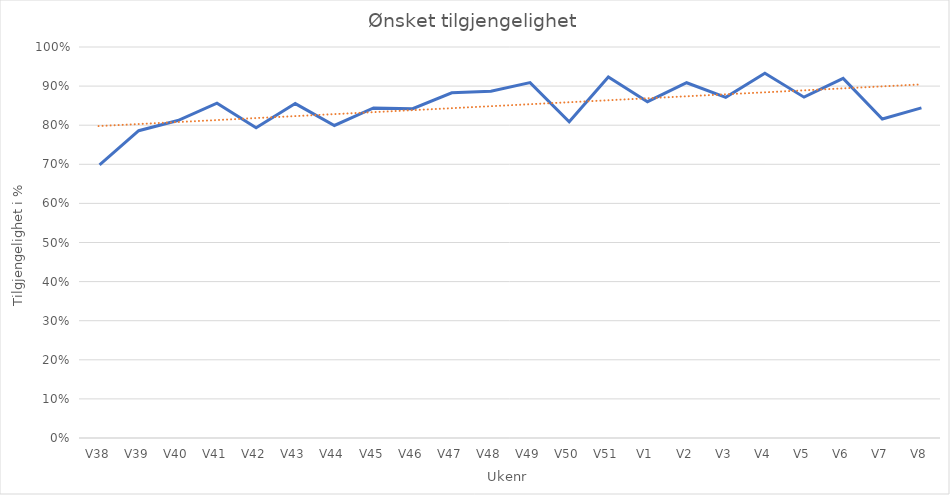
| Category | Ønsket |
|---|---|
| V38 | 0.699 |
| V39 | 0.786 |
| V40 | 0.812 |
| V41 | 0.856 |
| V42 | 0.794 |
| V43 | 0.855 |
| V44 | 0.799 |
| V45 | 0.844 |
| V46 | 0.842 |
| V47 | 0.883 |
| V48 | 0.887 |
| V49 | 0.909 |
| V50 | 0.809 |
| V51 | 0.923 |
| V1 | 0.86 |
| V2 | 0.909 |
| V3 | 0.871 |
| V4 | 0.933 |
| V5 | 0.872 |
| V6 | 0.92 |
| V7 | 0.816 |
| V8 | 0.844 |